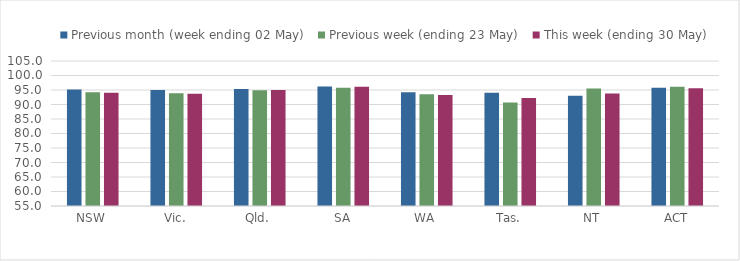
| Category | Previous month (week ending 02 May) | Previous week (ending 23 May) | This week (ending 30 May) |
|---|---|---|---|
| NSW | 95.18 | 94.241 | 94.071 |
| Vic. | 94.958 | 93.871 | 93.676 |
| Qld. | 95.303 | 94.922 | 94.957 |
| SA | 96.193 | 95.737 | 96.122 |
| WA | 94.22 | 93.557 | 93.305 |
| Tas. | 94.054 | 90.676 | 92.234 |
| NT | 93.044 | 95.535 | 93.785 |
| ACT | 95.733 | 96.141 | 95.631 |